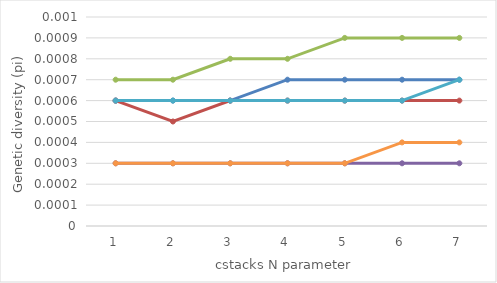
| Category | Series 0 | Series 1 | Series 2 | Series 3 | Series 4 | Series 5 |
|---|---|---|---|---|---|---|
| 0 | 0.001 | 0.001 | 0.001 | 0 | 0.001 | 0 |
| 1 | 0.001 | 0 | 0.001 | 0 | 0.001 | 0 |
| 2 | 0.001 | 0.001 | 0.001 | 0 | 0.001 | 0 |
| 3 | 0.001 | 0.001 | 0.001 | 0 | 0.001 | 0 |
| 4 | 0.001 | 0.001 | 0.001 | 0 | 0.001 | 0 |
| 5 | 0.001 | 0.001 | 0.001 | 0 | 0.001 | 0 |
| 6 | 0.001 | 0.001 | 0.001 | 0 | 0.001 | 0 |